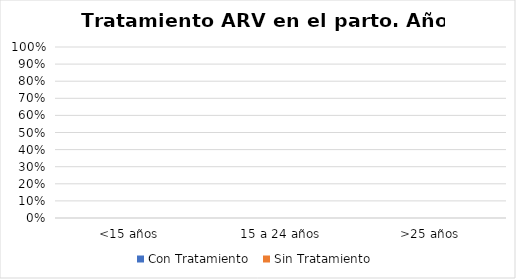
| Category | Con Tratamiento  | Sin Tratamiento  |
|---|---|---|
| <15 años | 0 | 0 |
| 15 a 24 años | 0 | 0 |
| >25 años | 0 | 0 |